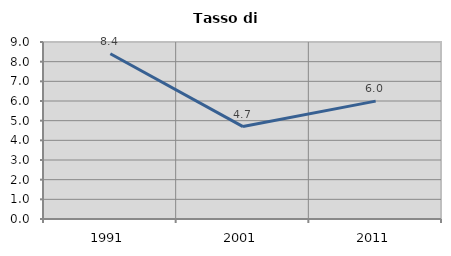
| Category | Tasso di disoccupazione   |
|---|---|
| 1991.0 | 8.401 |
| 2001.0 | 4.7 |
| 2011.0 | 5.994 |